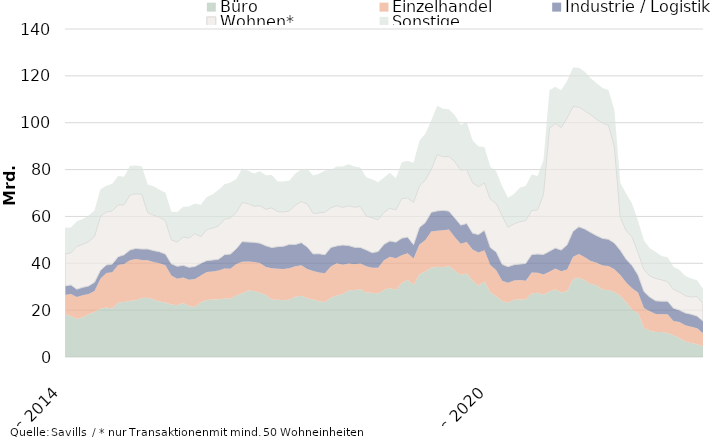
| Category | Büro | Einzelhandel | Industrie / Logistik | Wohnen* | Sonstige |
|---|---|---|---|---|---|
| 2014-12-01 | 18062775690.74 | 8359038033.03 | 3920968980.31 | 13718641413.41 | 11132525795.81 |
| 2015-01-01 | 17461692204.74 | 9435012663.03 | 3883908572.31 | 13694885050.41 | 10820352346.82 |
| 2015-02-01 | 16255290231.74 | 9372549053.81 | 3308490268.73 | 18255026522.91 | 10739371487.05 |
| 2015-03-01 | 17016358031.53 | 9334060176.81 | 3368654245.73 | 18361690467.91 | 10843377202.98 |
| 2015-04-01 | 18244972783.53 | 8600759739.81 | 3468694360.68 | 18935039794.91 | 11184131034.98 |
| 2015-05-01 | 19238000474.45 | 8936850539.31 | 3728635607.68 | 19506582676.91 | 11229798527.98 |
| 2015-06-01 | 20614824085.83 | 12804218553.14 | 3559231021.83 | 23077039312.51 | 11574720193.75 |
| 2015-07-01 | 21080237533.5 | 14814698989.21 | 3371725415.86 | 22644697118.35 | 11143910205.21 |
| 2015-08-01 | 20656625633.5 | 15562941505.21 | 3450767146.86 | 22691607883.35 | 11626767372.21 |
| 2015-09-01 | 23302273453.46 | 16001092585.73 | 3520511283.36 | 22121631489.35 | 12279196997.21 |
| 2015-10-01 | 23501772857.46 | 16181040556.36 | 3919085482.36 | 21349455176.35 | 11987539478.21 |
| 2015-11-01 | 23957423619.14 | 17339041737.5 | 4397719316.13 | 23451887702.29 | 12443601394.38 |
| 2015-12-01 | 24202213697.48 | 17587198961.04 | 4557113724.92 | 23375825542.77 | 11975940305.75 |
| 2016-01-01 | 25139700628.48 | 16270997225.45 | 4662502872.92 | 23334161447.77 | 12028959045.24 |
| 2016-02-01 | 25294714349.53 | 15952090497.99 | 4833139363.87 | 15563498654.77 | 12008953720.01 |
| 2016-03-01 | 24534844202.74 | 15997699828.72 | 4877967507.07 | 15108592339.77 | 12318880326.08 |
| 2016-04-01 | 23667928105.74 | 16386770286.07 | 4833846127.82 | 14760671477.37 | 11756957541.08 |
| 2016-05-01 | 23251081507.82 | 15941944380.07 | 4749671116.82 | 14232081715.37 | 11979556735.04 |
| 2016-06-01 | 22424129844.36 | 12364494883.06 | 4999570420.67 | 10189436595.87 | 12067576140.06 |
| 2016-07-01 | 22113990925.69 | 11257435985.56 | 5312245465.64 | 10404072475.53 | 12817090834.96 |
| 2016-08-01 | 23020503074.69 | 10878738868.56 | 5247332254.55 | 12050427222.53 | 12924367433.96 |
| 2016-09-01 | 21721152253.73 | 11278501725.47 | 5270185116.55 | 12498985369.53 | 13466325785.26 |
| 2016-10-01 | 21376679446.86 | 11872308168.84 | 5398267322.55 | 14009495152.42 | 12815064855.83 |
| 2016-11-01 | 23418913086.76 | 11371816740.7 | 5243284144.73 | 11319606979.49 | 13584628478.66 |
| 2016-12-01 | 24311240228.4 | 11942470429.99 | 4890351002.13 | 13270662270.49 | 13860642419.64 |
| 2017-01-01 | 24509608793.4 | 11953863686.96 | 4924744810.37 | 13669156871.49 | 14439441490.58 |
| 2017-02-01 | 24522929822.41 | 12378572437.09 | 4842785725 | 14207318507.49 | 15399823383.58 |
| 2017-03-01 | 24979801711.4 | 12787832178.37 | 5899654543.8 | 15107380846.79 | 14961863124.58 |
| 2017-04-01 | 24819990861.71 | 12853010576.9 | 6262060580.1 | 15428575157.19 | 15066124285.67 |
| 2017-05-01 | 26232596283.47 | 13514985630.15 | 6483702097.1 | 15461747545.2 | 14297593389.28 |
| 2017-06-01 | 27213166704.1 | 13474043478.5 | 8562546401.46 | 16748341270.79 | 14470141007.56 |
| 2017-07-01 | 28420051498.1 | 12322239347.93 | 8324132158.46 | 16426846580.79 | 13950696505.2 |
| 2017-08-01 | 28135534177.1 | 12429029136.93 | 8386695707.55 | 15389020182.79 | 13979801046.2 |
| 2017-09-01 | 27443892685.45 | 12637830917.94 | 8510058041.55 | 16036484989.78 | 14628427847.74 |
| 2017-10-01 | 26496035870.32 | 11930960273.94 | 9048046430.46 | 15587099126.87 | 14494347450.17 |
| 2017-11-01 | 24585217292.17 | 13335421843.83 | 8802947546.51 | 16954725036.87 | 13991797246.44 |
| 2017-12-01 | 24440717997.53 | 13186078236.48 | 9470343512.7 | 14947735472.87 | 12875205655.48 |
| 2018-01-01 | 24169632440.53 | 13385637745.1 | 9721702683.46 | 14644481680.86 | 12965625420.04 |
| 2018-02-01 | 24532655677.47 | 13346974130.65 | 10213193365.46 | 14254040308.86 | 12991286516.04 |
| 2018-03-01 | 25689146433.48 | 13025014136.64 | 9307934893.46 | 16861797743.49 | 13423676924.02 |
| 2018-04-01 | 26121570226.17 | 13083782210.76 | 9605919650.46 | 17541166648.49 | 13812859535.93 |
| 2018-05-01 | 25059149940.41 | 12454100846.51 | 9488564046.46 | 18390492426.48 | 14988664801.36 |
| 2018-06-01 | 24502115752.78 | 12171900363.34 | 7330050155.1 | 17324340647.56 | 16180804689.08 |
| 2018-07-01 | 23768042590.78 | 12322300226.32 | 7966869588.1 | 17450608751.56 | 16672007493.19 |
| 2018-08-01 | 23510045994.76 | 12247139005.19 | 7892000709.1 | 18148274126.41 | 17798374873.04 |
| 2018-09-01 | 25341157455.41 | 13289291079.55 | 8129841438.1 | 16962704659.42 | 16165594775.21 |
| 2018-10-01 | 26253931201.41 | 13760202882.82 | 7406435586.25 | 17174676866.32 | 16705006538.21 |
| 2018-11-01 | 26888009103.45 | 12507346034.88 | 8394898728.54 | 16108073420.32 | 17423267492.25 |
| 2018-12-01 | 28411133671.45 | 11512722354.68 | 7666795490.35 | 16973956914.32 | 17659710774.26 |
| 2019-01-01 | 28624375832.45 | 10984616615.68 | 7214323719.35 | 17160274095.2 | 17313329869.26 |
| 2019-02-01 | 28937833501.45 | 10992187442.4 | 6831262259.96 | 17513522042.2 | 16557159059.62 |
| 2019-03-01 | 27544432810.45 | 11171202657.26 | 6985219187.16 | 14474272923.27 | 16426926447.64 |
| 2019-04-01 | 27372510768.31 | 10721779269.12 | 6436402186.06 | 14889885528.14 | 16464762534.89 |
| 2019-05-01 | 27086717264.31 | 11007377577.12 | 6927571752.06 | 13578486873.14 | 15944373230.89 |
| 2019-06-01 | 28619667307.82 | 12681145920.09 | 6809920057.06 | 13618351757.47 | 14918333741.96 |
| 2019-07-01 | 29482520307.29 | 13328276761.26 | 6728675032.06 | 14001371322.47 | 15123984896.92 |
| 2019-08-01 | 28588686723.31 | 13581005313.39 | 6860393893.06 | 13736815812.62 | 13482843208.07 |
| 2019-09-01 | 31431753528.25 | 12033999494.97 | 7256389082.92 | 16844554255.62 | 15592958025.83 |
| 2019-10-01 | 32996593890.25 | 11314584887.7 | 6895687562.55 | 16686604858.74 | 15889399476.83 |
| 2019-11-01 | 30747652297.78 | 11283623755.75 | 5893842897.79 | 18035429153.74 | 16938532442.52 |
| 2019-12-01 | 35333825929.49 | 12729233930.88 | 7226755920.45 | 17719972058.74 | 19305302136.48 |
| 2020-01-01 | 36531141461.49 | 13436003498.88 | 7453434361.23 | 18157224812.87 | 19678778754.48 |
| 2020-02-01 | 38099058525.44 | 15499382207.37 | 8153950247.38 | 18363765931.37 | 20828827891.2 |
| 2020-03-01 | 38550852731.89 | 15348353698.15 | 8470739173.18 | 24050048197.37 | 20802783298.78 |
| 2020-04-01 | 38270850851.03 | 15863227930.17 | 8454767344.28 | 22908106646.5 | 20458776349.53 |
| 2020-05-01 | 38881659487.03 | 15503798044.17 | 7865864944.28 | 23336096487.5 | 20137314225.49 |
| 2020-06-01 | 36863967238.52 | 14249892871.21 | 8180845859.28 | 24099048462.5 | 19760014318.42 |
| 2020-07-01 | 35100846656.05 | 13289221607.06 | 7897157112.28 | 23512544941.5 | 19250334168.72 |
| 2020-08-01 | 35666705693.05 | 13410315043.06 | 7903742159.28 | 23019438157.5 | 20371509500.21 |
| 2020-09-01 | 32548010965.11 | 13308117743.68 | 6993249103.42 | 21488103702.49 | 18050626536.08 |
| 2020-10-01 | 30377863654.11 | 14232141322.68 | 7652755535.73 | 20471023725.49 | 17086798953.54 |
| 2020-11-01 | 32272707606.11 | 13317837196.68 | 8500880007.2 | 20188542385.49 | 15400933573.98 |
| 2020-12-01 | 27625165021.4 | 11665823550.74 | 7453393031.54 | 20611432435.49 | 13802815932.88 |
| 2021-01-01 | 25922292644.4 | 11086279196.74 | 7788343257.76 | 20716309315.49 | 13816564859.79 |
| 2021-02-01 | 23909270226.45 | 8616945364.53 | 7050296261 | 20712784697.99 | 12611658548.47 |
| 2021-03-01 | 23103754308 | 8542709511.89 | 6901126684.99 | 16854834848.99 | 12571457775.25 |
| 2021-04-01 | 24445734490 | 8172892560.01 | 6780450405.99 | 17402809013.99 | 12787391550.25 |
| 2021-05-01 | 24556778258 | 8300675545.01 | 6799570666.99 | 18167126016.99 | 14426521004.29 |
| 2021-06-01 | 24564712115 | 7976784992 | 7442419746.99 | 18226182212.99 | 14893365800.91 |
| 2021-07-01 | 27096908880 | 8946495241 | 7685665984.99 | 18785811487.74 | 15380416702.54 |
| 2021-08-01 | 27381485355 | 8588029166 | 7973074710.96 | 18901381563.74 | 14374250615.05 |
| 2021-09-01 | 26583833618 | 8673767815.91 | 8545495709.96 | 25629322018.75 | 14806322793.41 |
| 2021-10-01 | 27976146105.69 | 8385660425.91 | 8750582399.96 | 52501286139.75 | 16203607137.32 |
| 2021-11-01 | 28869809103.69 | 8903617601.91 | 8755552913.96 | 53116738980.75 | 15682010779.88 |
| 2021-12-01 | 27486490912.69 | 9091146920.86 | 9058724684.96 | 52306052488.25 | 15911718226.98 |
| 2022-01-01 | 28031135110.69 | 9315774980.07 | 10564640071.97 | 54152314759.25 | 15815971210.07 |
| 2022-02-01 | 33207067958.24 | 9592118324.13 | 10884960143.97 | 53241290616.79 | 16686139999.17 |
| 2022-03-01 | 33946785395.27 | 10065682922.43 | 11570573114.93 | 51107123050.79 | 16747285170.48 |
| 2022-04-01 | 32664499595.27 | 9945157957.43 | 11993854151.93 | 50503999418.79 | 16663945475.48 |
| 2022-05-01 | 31125193747.27 | 9878526536.43 | 12156046280.93 | 50270647458.79 | 15528955696.48 |
| 2022-06-01 | 30599994788.74 | 9654726857.42 | 11522419839.93 | 49707368541.79 | 15318436387.32 |
| 2022-07-01 | 28678258351.74 | 10395369164.8 | 11552338908.93 | 49231995043.04 | 15001577672.32 |
| 2022-08-01 | 28623980028.74 | 10186491398.8 | 11445785093.96 | 48711417034.02 | 15034757196.32 |
| 2022-09-01 | 27784288953.74 | 9632330188.89 | 11196978657.96 | 41148135072.17 | 15807249733.27 |
| 2022-10-01 | 26111579119.05 | 8901542364.89 | 10532370813.96 | 14109575596.17 | 14768461087.88 |
| 2022-11-01 | 23352831057.49 | 8443326908.89 | 9881801612.96 | 12298496042.17 | 15703391925.8 |
| 2022-12-01 | 20211163559.49 | 9142239345.94 | 9652007449.94 | 12150611492.67 | 14213710249.84 |
| 2023-01-01 | 18780895172.49 | 8712890743.73 | 7496504559.93 | 9699649565.65 | 13436992380.84 |
| 2023-02-01 | 12490315896.94 | 8402580292.67 | 7078973358.93 | 9335553360.11 | 12414437026.98 |
| 2023-03-01 | 11256081460.91 | 8295769800.37 | 5994959284.98 | 9054825734.11 | 11771348192.31 |
| 2023-04-01 | 10683362085.91 | 7649193636.37 | 5649394287.98 | 9547690016.53 | 11249923541.31 |
| 2023-05-01 | 10633502484.91 | 7597749200.37 | 5587325227.98 | 9125471222.53 | 10180966550.31 |
| 2023-06-01 | 10280112987.44 | 7999269019.37 | 5565733960.95 | 8338813293.53 | 10393055264.85 |
| 2023-07-01 | 9236306588.44 | 6135683001.99 | 5456679568.92 | 8052029163.29 | 9678739564.85 |
| 2023-08-01 | 8089722411.44 | 6840107155.29 | 5105590292.92 | 7734450586.31 | 9431400533.85 |
| 2023-09-01 | 6656125956.44 | 6945514638.29 | 5219098723.92 | 7353041922.16 | 8366315669.9 |
| 2023-10-01 | 5969061773.44 | 6896505274.29 | 5399429029.9 | 7353708958.16 | 7917146902.92 |
| 2023-11-01 | 5425795337 | 6819721682.29 | 5220668564.9 | 8364386456.01 | 6881309292 |
| 2023-12-01 | 4600852857 | 5530899699.29 | 5188152566.92 | 7478646854.01 | 6202598900 |